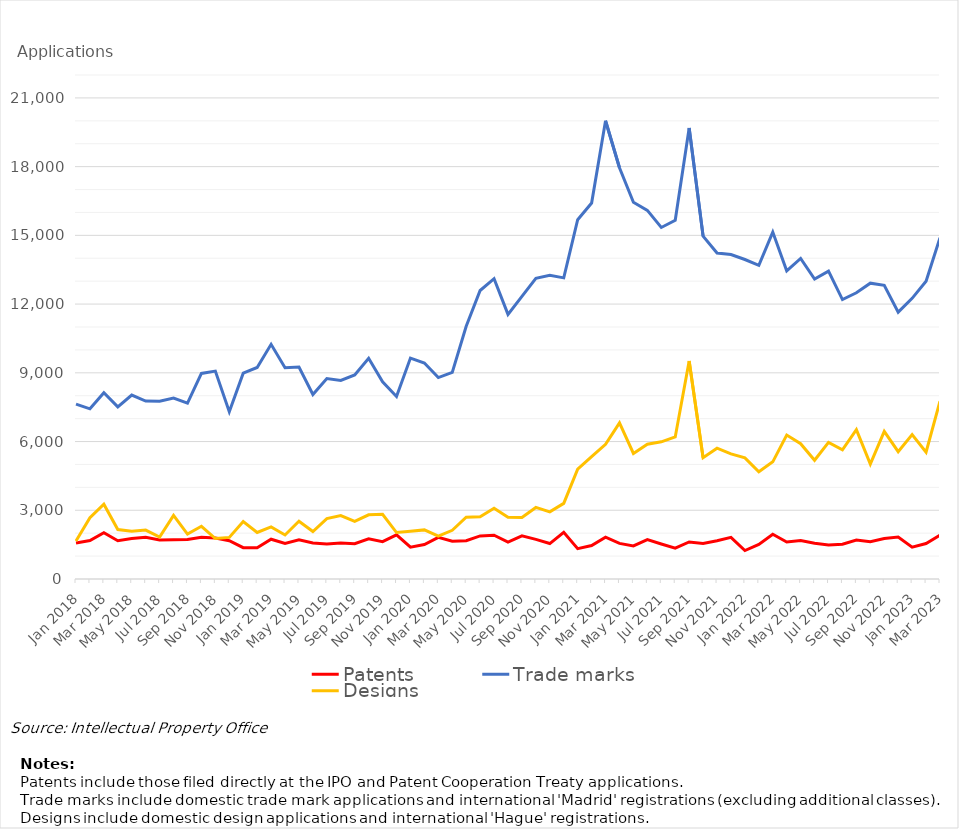
| Category | Patents | Trade marks | Designs |
|---|---|---|---|
| Jan 2018 | 1575 | 7634 | 1658 |
| Feb 2018 | 1676 | 7428 | 2672 |
| Mar 2018 | 2022 | 8127 | 3267 |
| Apr 2018 | 1670 | 7512 | 2160 |
| May 2018 | 1767 | 8030 | 2083 |
| Jun 2018 | 1821 | 7769 | 2136 |
| Jul 2018 | 1704 | 7757 | 1832 |
| Aug 2018 | 1713 | 7897 | 2777 |
| Sep 2018 | 1725 | 7673 | 1960 |
| Oct 2018 | 1818 | 8972 | 2302 |
| Nov 2018 | 1787 | 9076 | 1765 |
| Dec 2018 | 1670 | 7304 | 1815 |
| Jan 2019 | 1367 | 8985 | 2505 |
| Feb 2019 | 1361 | 9234 | 2031 |
| Mar 2019 | 1737 | 10243 | 2274 |
| Apr 2019 | 1552 | 9219 | 1923 |
| May 2019 | 1710 | 9251 | 2520 |
| Jun 2019 | 1569 | 8053 | 2074 |
| Jul 2019 | 1527 | 8752 | 2634 |
| Aug 2019 | 1571 | 8670 | 2768 |
| Sep 2019 | 1540 | 8907 | 2511 |
| Oct 2019 | 1755 | 9636 | 2800 |
| Nov 2019 | 1630 | 8607 | 2827 |
| Dec 2019 | 1926 | 7970 | 2028 |
| Jan 2020 | 1391 | 9642 | 2082 |
| Feb 2020 | 1504 | 9428 | 2143 |
| Mar 2020 | 1819 | 8794 | 1872 |
| Apr 2020 | 1648 | 9021 | 2127 |
| May 2020 | 1672 | 11035 | 2695 |
| Jun 2020 | 1879 | 12593 | 2721 |
| Jul 2020 | 1912 | 13110 | 3086 |
| Aug 2020 | 1613 | 11551 | 2695 |
| Sep 2020 | 1886 | 12340 | 2686 |
| Oct 2020 | 1730 | 13126 | 3124 |
| Nov 2020 | 1547 | 13254 | 2930 |
| Dec 2020 | 2042 | 13144 | 3302 |
| Jan 2021 | 1324 | 15685 | 4792 |
| Feb 2021 | 1462 | 16413 | 5340 |
| Mar 2021 | 1828 | 20001 | 5878 |
| Apr 2021 | 1554 | 17951 | 6815 |
| May 2021 | 1446 | 16446 | 5480 |
| Jun 2021 | 1716 | 16091 | 5881 |
| Jul 2021 | 1528 | 15345 | 5989 |
| Aug 2021 | 1344 | 15659 | 6200 |
| Sep 2021 | 1615 | 19685 | 9517 |
| Oct 2021 | 1547 | 14968 | 5292 |
| Nov 2021 | 1670 | 14232 | 5712 |
| Dec 2021 | 1818 | 14162 | 5464 |
| Jan 2022 | 1240 | 13946 | 5288 |
| Feb 2022 | 1506 | 13691 | 4683 |
| Mar 2022 | 1952 | 15142 | 5114 |
| Apr 2022 | 1616 | 13450 | 6282 |
| May 2022 | 1682 | 13992 | 5907 |
| Jun 2022 | 1559 | 13095 | 5183 |
| Jul 2022 | 1485 | 13439 | 5963 |
| Aug 2022 | 1520 | 12197 | 5639 |
| Sep 2022 | 1702 | 12494 | 6515 |
| Oct 2022 | 1630 | 12914 | 5012 |
| Nov 2022 | 1770 | 12819 | 6445 |
| Dec 2022 | 1828 | 11649 | 5558 |
| Jan 2023 | 1392 | 12250 | 6302 |
| Feb 2023 | 1550 | 13001 | 5534 |
| Mar 2023 | 1910 | 14896 | 7760 |